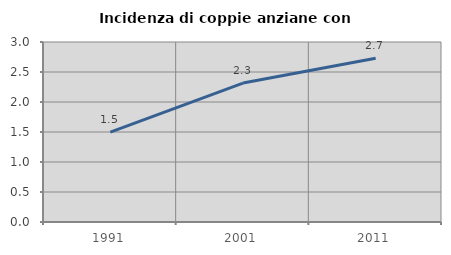
| Category | Incidenza di coppie anziane con figli |
|---|---|
| 1991.0 | 1.497 |
| 2001.0 | 2.315 |
| 2011.0 | 2.729 |